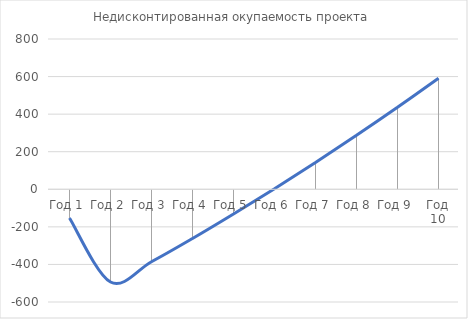
| Category | Недисконтированная окупаемость проекта |
|---|---|
| Год 1 | -153 |
| Год 2 | -493.648 |
| Год 3 | -385.516 |
| Год 4 | -262.047 |
| Год 5 | -131.582 |
| Год 6 | 3.372 |
| Год 7 | 142.948 |
| Год 8 | 287.284 |
| Год 9 | 436.521 |
| Год 10 | 590.803 |